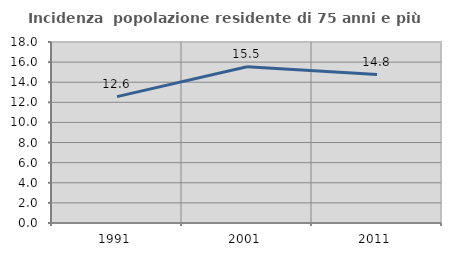
| Category | Incidenza  popolazione residente di 75 anni e più |
|---|---|
| 1991.0 | 12.57 |
| 2001.0 | 15.531 |
| 2011.0 | 14.76 |